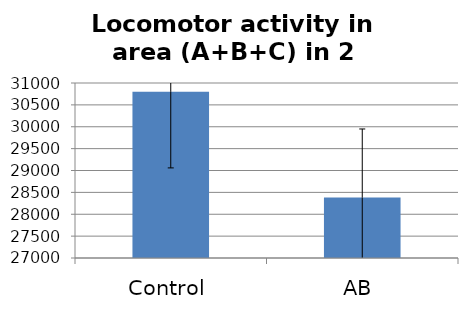
| Category | Series 0 |
|---|---|
| Control | 30797.857 |
| AB | 28381.833 |